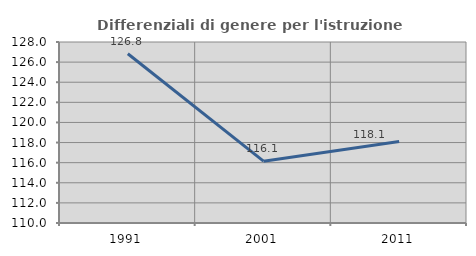
| Category | Differenziali di genere per l'istruzione superiore |
|---|---|
| 1991.0 | 126.832 |
| 2001.0 | 116.146 |
| 2011.0 | 118.109 |